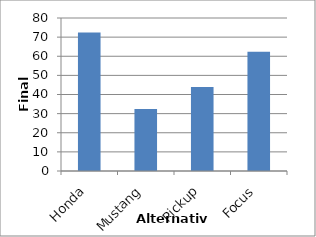
| Category | Series 0 |
|---|---|
| Honda | 72.449 |
| Mustang | 32.381 |
| Pickup | 43.963 |
| Focus | 62.381 |